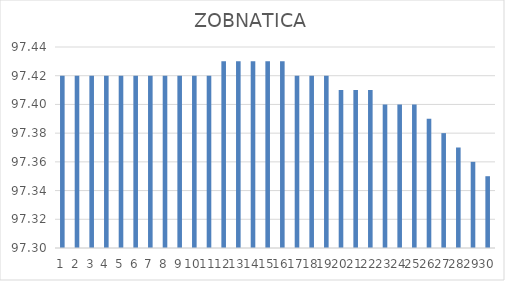
| Category | ZOBNATICA |
|---|---|
| 0 | 97.42 |
| 1 | 97.42 |
| 2 | 97.42 |
| 3 | 97.42 |
| 4 | 97.42 |
| 5 | 97.42 |
| 6 | 97.42 |
| 7 | 97.42 |
| 8 | 97.42 |
| 9 | 97.42 |
| 10 | 97.42 |
| 11 | 97.43 |
| 12 | 97.43 |
| 13 | 97.43 |
| 14 | 97.43 |
| 15 | 97.43 |
| 16 | 97.42 |
| 17 | 97.42 |
| 18 | 97.42 |
| 19 | 97.41 |
| 20 | 97.41 |
| 21 | 97.41 |
| 22 | 97.4 |
| 23 | 97.4 |
| 24 | 97.4 |
| 25 | 97.39 |
| 26 | 97.38 |
| 27 | 97.37 |
| 28 | 97.36 |
| 29 | 97.35 |